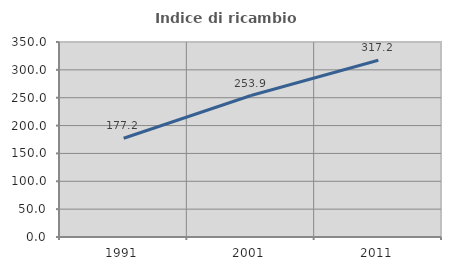
| Category | Indice di ricambio occupazionale  |
|---|---|
| 1991.0 | 177.193 |
| 2001.0 | 253.943 |
| 2011.0 | 317.178 |